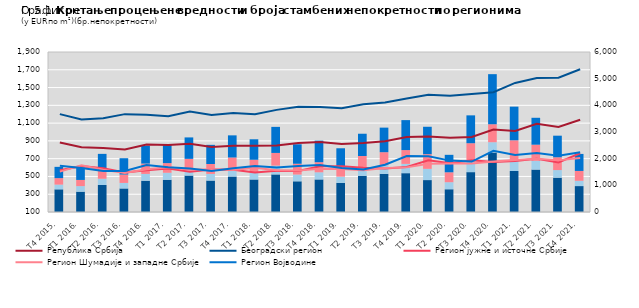
| Category | Series 5 | Series 6 | Series 7 | Series 8 |
|---|---|---|---|---|
| Т4 2015. | 850 | 177 | 243 | 423 |
| Т1 2016. | 762 | 208 | 232 | 464 |
| Т2 2016. | 1014 | 233 | 310 | 623 |
| Т3 2016. | 883 | 207 | 315 | 612 |
| Т4 2016. | 1173 | 255 | 388 | 671 |
| Т1 2017. | 1208 | 263 | 362 | 713 |
| Т2 2017. | 1367 | 255 | 371 | 804 |
| Т3 2017. | 1179 | 249 | 371 | 719 |
| Т4 2017. | 1330 | 296 | 418 | 830 |
| Т1 2018. | 1219 | 271 | 470 | 767 |
| Т2 2018. | 1409 | 332 | 474 | 977 |
| Т3 2018. | 1151 | 253 | 405 | 730 |
| Т4 2018. | 1221 | 268 | 379 | 808 |
| Т1 2019. | 1093 | 232 | 378 | 687 |
| Т2 2019. | 1356 | 305 | 439 | 835 |
| Т3 2019. | 1429 | 325 | 489 | 921 |
| Т4 2019. | 1456 | 348 | 518 | 1124 |
| Т1 2020. | 1197 | 421 | 551 | 1027 |
| Т2 2020. | 853 | 264 | 372 | 655 |
| Т3 2020. | 1495 | 399 | 685 | 1045 |
| Т4 2020. | 2232 | 385 | 674 | 1878 |
| T1 2021. | 1538 | 406 | 745 | 1262 |
| T2 2021. | 1591 | 329 | 604 | 1009 |
| Т3 2021. | 1287 | 285 | 480 | 810 |
| Т4 2021. | 972 | 198 | 370 | 638 |